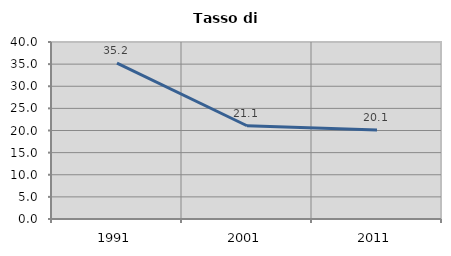
| Category | Tasso di disoccupazione   |
|---|---|
| 1991.0 | 35.224 |
| 2001.0 | 21.077 |
| 2011.0 | 20.115 |